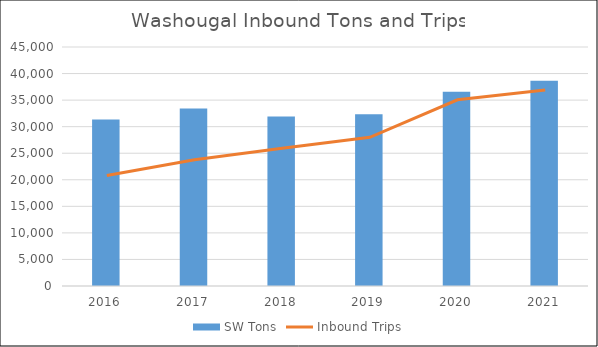
| Category | SW Tons |
|---|---|
| 2016.0 | 31372.44 |
| 2017.0 | 33414.22 |
| 2018.0 | 31919.29 |
| 2019.0 | 32326.41 |
| 2020.0 | 36566.32 |
| 2021.0 | 38638.16 |